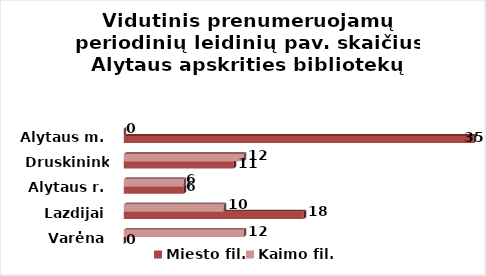
| Category | Miesto fil. | Kaimo fil. |
|---|---|---|
| Varėna | 0 | 12 |
| Lazdijai | 18 | 10 |
| Alytaus r. | 6 | 6 |
| Druskininkai | 11 | 12 |
| Alytaus m. | 35 | 0 |